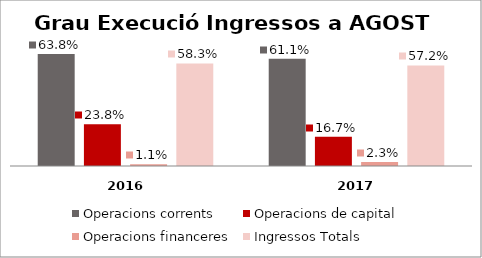
| Category | Operacions corrents | Operacions de capital | Operacions financeres | Ingressos Totals |
|---|---|---|---|---|
| 0 | 0.638 | 0.238 | 0.011 | 0.583 |
| 1 | 0.611 | 0.167 | 0.023 | 0.572 |